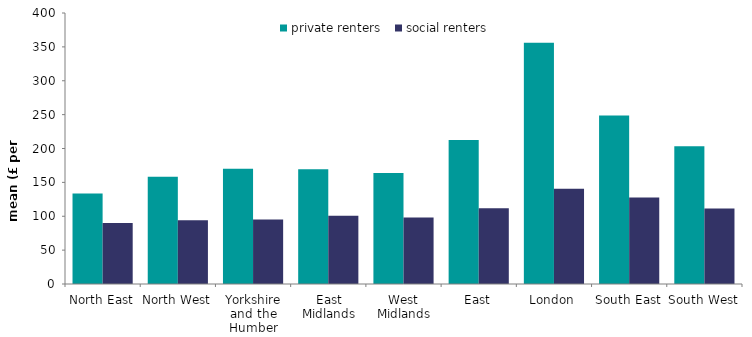
| Category | private renters | social renters |
|---|---|---|
| North East | 133.469 | 90.038 |
| North West | 158.301 | 94.123 |
| Yorkshire and the Humber | 170.242 | 95.048 |
| East Midlands | 169.413 | 100.768 |
| West Midlands | 163.989 | 98.311 |
| East | 212.416 | 111.909 |
| London | 356.218 | 140.432 |
| South East | 248.827 | 127.612 |
| South West | 203.355 | 111.465 |